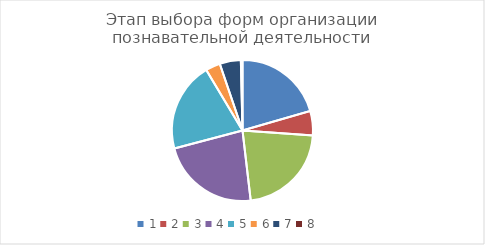
| Category | Series 0 |
|---|---|
| 0 | 0.216 |
| 1 | 0.059 |
| 2 | 0.231 |
| 3 | 0.239 |
| 4 | 0.216 |
| 5 | 0.035 |
| 6 | 0.051 |
| 7 | 0.004 |